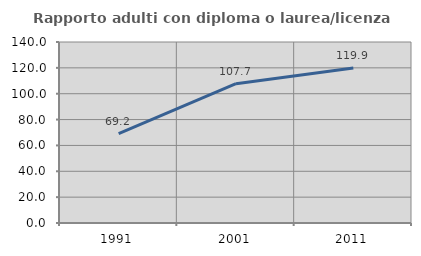
| Category | Rapporto adulti con diploma o laurea/licenza media  |
|---|---|
| 1991.0 | 69.174 |
| 2001.0 | 107.723 |
| 2011.0 | 119.864 |